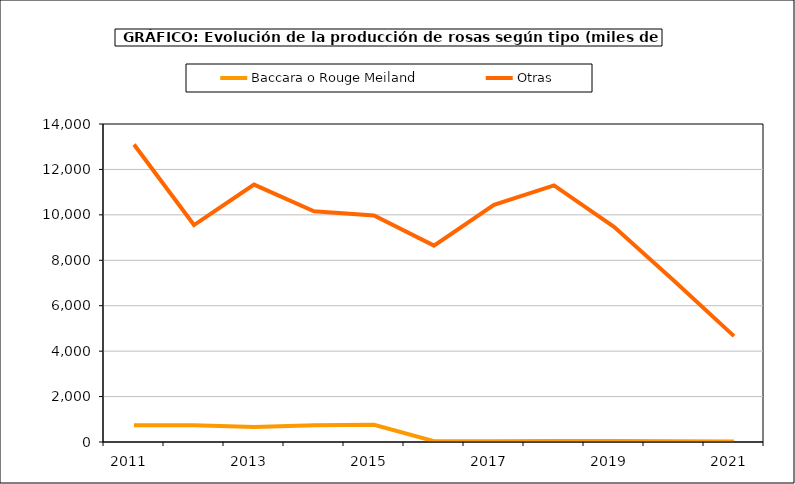
| Category | Baccara o Rouge Meiland | Otras |
|---|---|---|
| 2011.0 | 741 | 13099 |
| 2012.0 | 741 | 9551 |
| 2013.0 | 662 | 11331 |
| 2014.0 | 739 | 10158 |
| 2015.0 | 756 | 9969 |
| 2016.0 | 38 | 8644 |
| 2017.0 | 38 | 10442 |
| 2018.0 | 43 | 11297 |
| 2019.0 | 39 | 9474 |
| 2020.0 | 31 | 7104 |
| 2021.0 | 27 | 4662 |